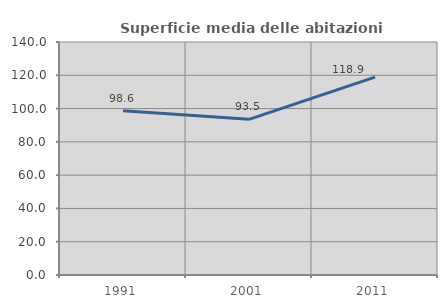
| Category | Superficie media delle abitazioni occupate |
|---|---|
| 1991.0 | 98.626 |
| 2001.0 | 93.528 |
| 2011.0 | 118.885 |